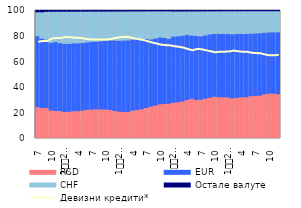
| Category | RSD | EUR | CHF | Остале валуте |
|---|---|---|---|---|
| 7 | 24.818 | 54.789 | 19.339 | 1.053 |
| 8 | 24.149 | 53.574 | 21.245 | 1.032 |
| 9 | 24.248 | 52.694 | 22.376 | 0.682 |
| 10 | 22.302 | 52.149 | 24.932 | 0.617 |
| 11 | 21.845 | 53.099 | 24.433 | 0.623 |
| 12 | 21.796 | 52.34 | 25.262 | 0.602 |
| 1
2009. | 21.095 | 52.607 | 25.716 | 0.582 |
| 2 | 21.263 | 52.362 | 25.804 | 0.57 |
| 3 | 21.645 | 52.421 | 25.368 | 0.566 |
| 4 | 21.754 | 52.32 | 25.383 | 0.544 |
| 5 | 22.183 | 52.161 | 25.127 | 0.529 |
| 6 | 22.779 | 52.029 | 24.664 | 0.528 |
| 7 | 23.011 | 52.267 | 24.206 | 0.516 |
| 8 | 23.089 | 52.296 | 24.11 | 0.505 |
| 9 | 23.123 | 52.545 | 23.84 | 0.492 |
| 10 | 23.01 | 53.022 | 23.493 | 0.475 |
| 11 | 22.652 | 53.559 | 23.327 | 0.462 |
| 12 | 21.871 | 54.409 | 23.264 | 0.456 |
| 1
2010. | 21.306 | 54.749 | 23.503 | 0.442 |
| 2 | 20.944 | 55.283 | 23.341 | 0.431 |
| 3 | 21.147 | 55.192 | 23.259 | 0.403 |
| 4 | 22.066 | 54.88 | 22.667 | 0.387 |
| 5 | 22.629 | 54.547 | 22.447 | 0.377 |
| 6 | 23.264 | 53.15 | 23.229 | 0.357 |
| 7 | 24.25 | 53.111 | 22.293 | 0.346 |
| 8 | 25.268 | 51.803 | 22.599 | 0.33 |
| 9 | 26.112 | 51.715 | 21.852 | 0.321 |
| 10 | 27.025 | 51.644 | 21.024 | 0.306 |
| 11 | 27.405 | 50.882 | 21.42 | 0.293 |
| 12 | 27.553 | 50.158 | 22.001 | 0.288 |
| 1
2011. | 28.269 | 51.116 | 20.189 | 0.426 |
| 2 | 28.712 | 50.828 | 20.039 | 0.421 |
| 3 | 29.374 | 50.783 | 19.44 | 0.404 |
| 4 | 30.501 | 50.11 | 19.006 | 0.383 |
| 5 | 31.469 | 48.767 | 19.392 | 0.372 |
| 6 | 30.472 | 49.552 | 19.617 | 0.359 |
| 7 | 30.617 | 48.914 | 20.131 | 0.338 |
| 8 | 31.466 | 48.821 | 19.381 | 0.333 |
| 9 | 32.205 | 48.824 | 18.653 | 0.318 |
| 10 | 33.017 | 48.366 | 18.317 | 0.301 |
| 11 | 32.626 | 48.776 | 18.297 | 0.3 |
| 12 | 32.567 | 48.83 | 18.362 | 0.241 |
| 1
2012. | 32.447 | 48.832 | 18.486 | 0.235 |
| 2 | 31.713 | 49.385 | 18.667 | 0.234 |
| 3 | 32.192 | 49.056 | 18.523 | 0.229 |
| 4 | 32.643 | 48.693 | 18.439 | 0.225 |
| 5 | 32.539 | 48.784 | 18.456 | 0.222 |
| 6 | 33.392 | 48.224 | 18.168 | 0.216 |
| 7 | 33.65 | 48.09 | 18.047 | 0.213 |
| 8 | 33.829 | 48.042 | 17.919 | 0.21 |
| 9 | 34.792 | 47.54 | 17.468 | 0.199 |
| 10 | 35.398 | 47.171 | 17.239 | 0.193 |
| 11 | 35.436 | 47.221 | 17.157 | 0.186 |
| 12 | 35.032 | 47.639 | 17.142 | 0.187 |